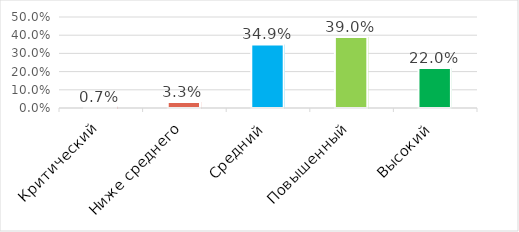
| Category | Series 0 |
|---|---|
| Критический | 0.007 |
| Ниже среднего | 0.033 |
| Средний | 0.349 |
| Повышенный | 0.39 |
| Высокий | 0.22 |